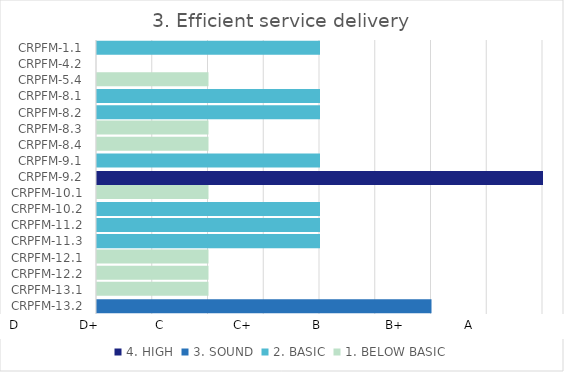
| Category | 4. HIGH | 3. SOUND | 2. BASIC | 1. BELOW BASIC |
|---|---|---|---|---|
| CRPFM-13.2 | 0 | 3 | 0 | 0 |
| CRPFM-13.1 | 0 | 0 | 0 | 1 |
| CRPFM-12.2 | 0 | 0 | 0 | 1 |
| CRPFM-12.1 | 0 | 0 | 0 | 1 |
| CRPFM-11.3 | 0 | 0 | 2 | 0 |
| CRPFM-11.2 | 0 | 0 | 2 | 0 |
| CRPFM-10.2 | 0 | 0 | 2 | 0 |
| CRPFM-10.1 | 0 | 0 | 0 | 1 |
| CRPFM-9.2 | 4 | 0 | 0 | 0 |
| CRPFM-9.1 | 0 | 0 | 2 | 0 |
| CRPFM-8.4 | 0 | 0 | 0 | 1 |
| CRPFM-8.3 | 0 | 0 | 0 | 1 |
| CRPFM-8.2 | 0 | 0 | 2 | 0 |
| CRPFM-8.1 | 0 | 0 | 2 | 0 |
| CRPFM-5.4 | 0 | 0 | 0 | 1 |
| CRPFM-4.2 | 0 | 0 | 0 | 0 |
| CRPFM-1.1 | 0 | 0 | 2 | 0 |